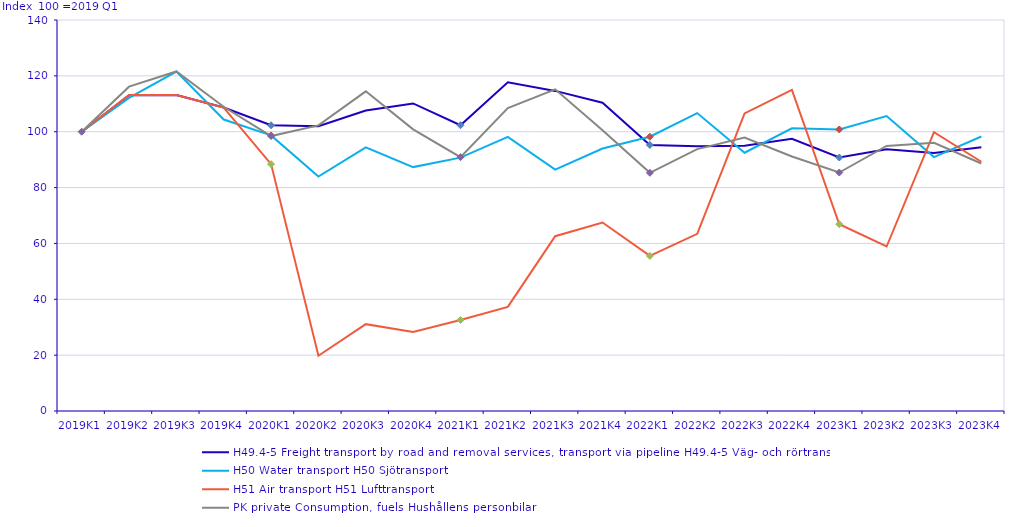
| Category | H49.4-5 Freight transport by road and removal services, transport via pipeline | H50 Water transport | H51 Air transport | PK private Consumption, fuels |
|---|---|---|---|---|
| 2019K1 | 100 | 100 | 100 | 100 |
| 2019K2 | 113.051 | 112.119 | 113.13 | 116.127 |
| 2019K3 | 113.118 | 121.54 | 113.155 | 121.588 |
| 2019K4 | 108.678 | 104.368 | 108.666 | 108.93 |
| 2020K1 | 102.301 | 98.685 | 88.405 | 98.443 |
| 2020K2 | 101.979 | 83.953 | 19.784 | 102.276 |
| 2020K3 | 107.574 | 94.366 | 31.088 | 114.457 |
| 2020K4 | 110.126 | 87.329 | 28.259 | 100.838 |
| 2021K1 | 102.325 | 90.724 | 32.594 | 90.888 |
| 2021K2 | 117.719 | 98.136 | 37.269 | 108.481 |
| 2021K3 | 114.614 | 86.434 | 62.582 | 115.167 |
| 2021K4 | 110.383 | 93.993 | 67.481 | 100.563 |
| 2022K1 | 95.264 | 98.196 | 55.527 | 85.281 |
| 2022K2 | 94.755 | 106.678 | 63.443 | 93.781 |
| 2022K3 | 94.939 | 92.476 | 106.566 | 97.896 |
| 2022K4 | 97.459 | 101.217 | 114.98 | 91.117 |
| 2023K1 | 90.761 | 100.809 | 66.875 | 85.39 |
| 2023K2 | 93.702 | 105.61 | 58.896 | 94.885 |
| 2023K3 | 92.369 | 90.913 | 99.82 | 96.034 |
| 2023K4 | 94.453 | 98.297 | 89.238 | 88.621 |